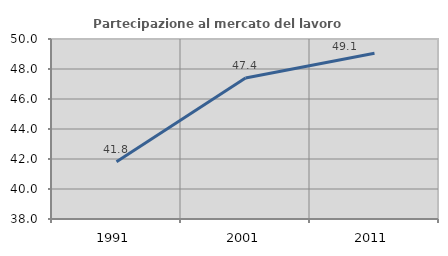
| Category | Partecipazione al mercato del lavoro  femminile |
|---|---|
| 1991.0 | 41.82 |
| 2001.0 | 47.394 |
| 2011.0 | 49.055 |